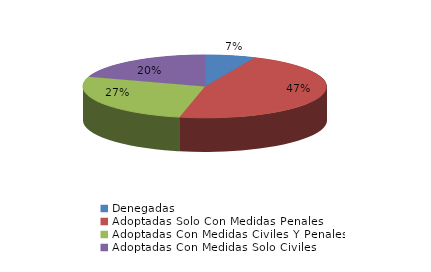
| Category | Series 0 |
|---|---|
| Denegadas | 1 |
| Adoptadas Solo Con Medidas Penales | 7 |
| Adoptadas Con Medidas Civiles Y Penales | 4 |
| Adoptadas Con Medidas Solo Civiles | 3 |